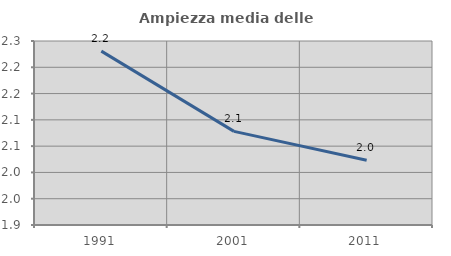
| Category | Ampiezza media delle famiglie |
|---|---|
| 1991.0 | 2.231 |
| 2001.0 | 2.078 |
| 2011.0 | 2.023 |